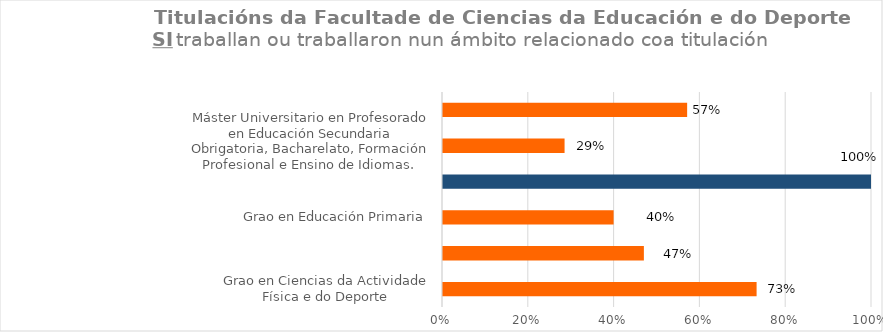
| Category | Series 1 |
|---|---|
| Grao en Ciencias da Actividade Física e do Deporte | 0.733 |
| Grao en Educación Infantil | 0.471 |
| Grao en Educación Primaria | 0.4 |
| Máster Universitario en Investigación en Actividade Física, Deporte e Saúde | 1 |
| Máster Universitario en Profesorado en Educación Secundaria Obrigatoria, Bacharelato, Formación Profesional e Ensino de Idiomas.  | 0.286 |
| Máster Universitario en Necesidades Específicas de Apoio Educativo | 0.571 |